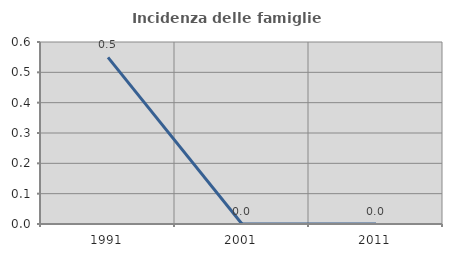
| Category | Incidenza delle famiglie numerose |
|---|---|
| 1991.0 | 0.549 |
| 2001.0 | 0 |
| 2011.0 | 0 |